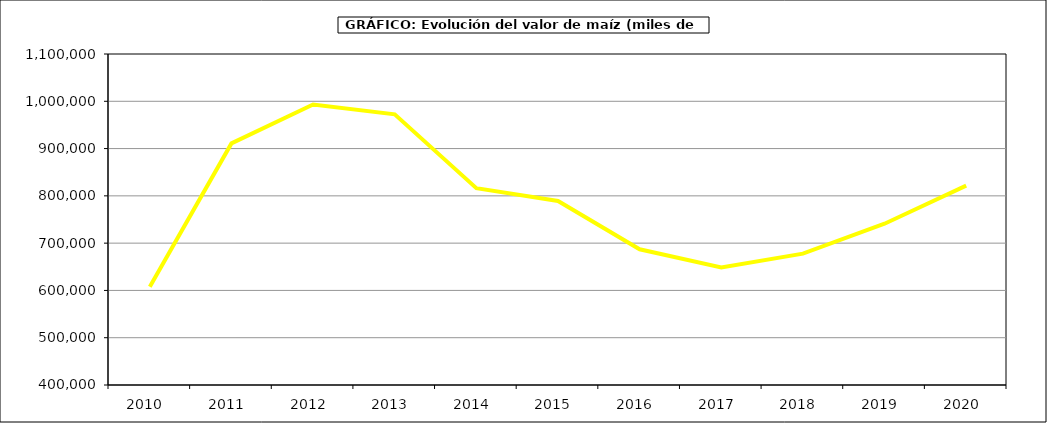
| Category | Valor |
|---|---|
| 2010.0 | 607777.279 |
| 2011.0 | 910964.166 |
| 2012.0 | 993073.028 |
| 2013.0 | 972315.092 |
| 2014.0 | 816366 |
| 2015.0 | 789188 |
| 2016.0 | 686933 |
| 2017.0 | 648655.811 |
| 2018.0 | 677820.352 |
| 2019.0 | 741067.689 |
| 2020.0 | 821749.89 |